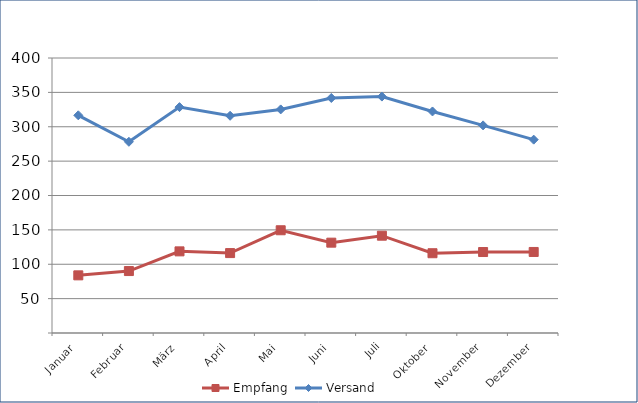
| Category | Empfang | Versand |
|---|---|---|
| Januar | 83.852 | 316.638 |
| Februar | 90.1 | 278.129 |
| März | 118.744 | 328.551 |
| April | 116.23 | 315.935 |
| Mai | 149.438 | 325.22 |
| Juni | 131.405 | 341.842 |
| Juli | 141.543 | 343.872 |
| Oktober | 116.032 | 322.239 |
| November | 117.795 | 302.012 |
| Dezember | 117.868 | 281.24 |